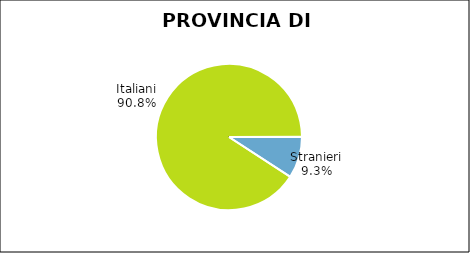
| Category | Provincia di Varese |
|---|---|
| Italiani | 55897 |
| Stranieri | 5682 |